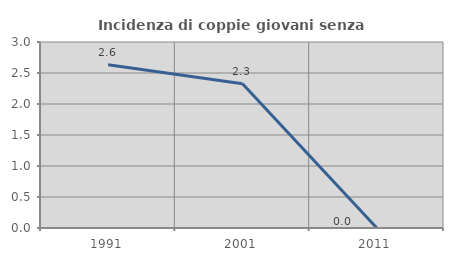
| Category | Incidenza di coppie giovani senza figli |
|---|---|
| 1991.0 | 2.632 |
| 2001.0 | 2.326 |
| 2011.0 | 0 |